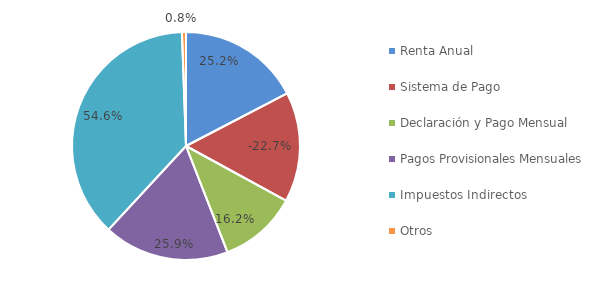
| Category | Composición Ingresos Efectivos Tributarios No Mineros 2022 |
|---|---|
| Renta Anual | 0.252 |
| Sistema de Pago | -0.227 |
| Declaración y Pago Mensual | 0.162 |
| Pagos Provisionales Mensuales | 0.259 |
| Impuestos Indirectos | 0.546 |
| Otros | 0.008 |